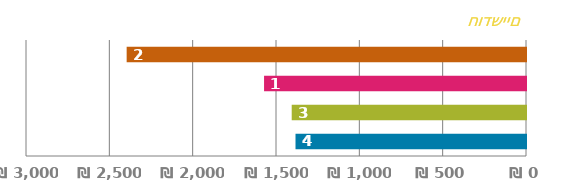
| Category | מראש |
|---|---|
| 0 | 1382.921 |
| 1 | 1405.775 |
| 2 | 1571.655 |
| 3 | 2396.046 |